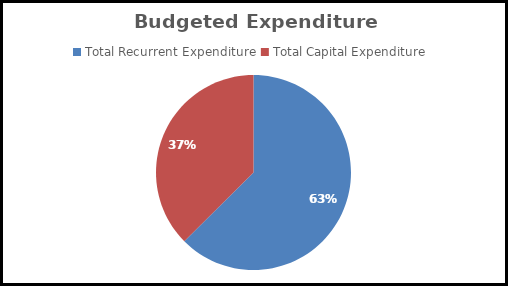
| Category | Series 0 |
|---|---|
| Total Recurrent Expenditure  | 0.626 |
| Total Capital Expenditure  | 0.374 |